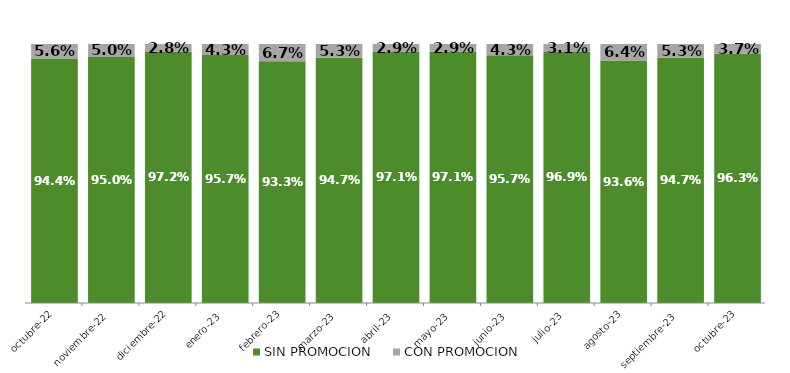
| Category | SIN PROMOCION   | CON PROMOCION   |
|---|---|---|
| 2022-10-01 | 0.944 | 0.056 |
| 2022-11-01 | 0.95 | 0.05 |
| 2022-12-01 | 0.972 | 0.028 |
| 2023-01-01 | 0.957 | 0.043 |
| 2023-02-01 | 0.933 | 0.067 |
| 2023-03-01 | 0.947 | 0.053 |
| 2023-04-01 | 0.971 | 0.029 |
| 2023-05-01 | 0.971 | 0.029 |
| 2023-06-01 | 0.957 | 0.043 |
| 2023-07-01 | 0.969 | 0.031 |
| 2023-08-01 | 0.936 | 0.064 |
| 2023-09-01 | 0.947 | 0.053 |
| 2023-10-01 | 0.963 | 0.037 |